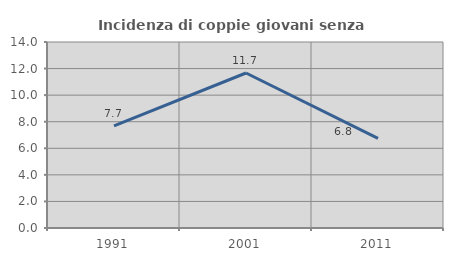
| Category | Incidenza di coppie giovani senza figli |
|---|---|
| 1991.0 | 7.679 |
| 2001.0 | 11.667 |
| 2011.0 | 6.751 |